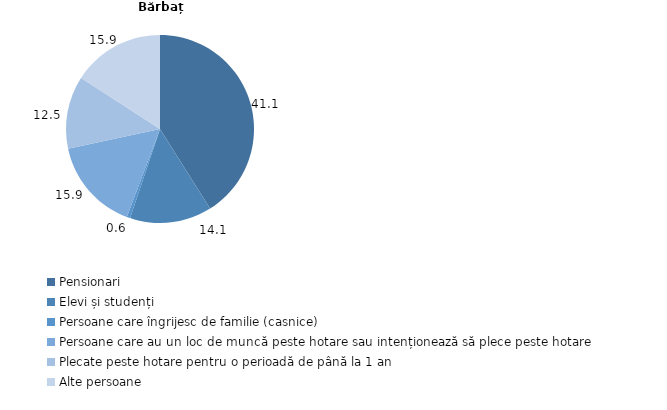
| Category | Bărbați |
|---|---|
| Pensionari | 41.054 |
| Elevi și studenți | 14.104 |
| Persoane care îngrijesc de familie (casnice) | 0.59 |
| Persoane care au un loc de muncă peste hotare sau intenționează să plece peste hotare | 15.881 |
| Plecate peste hotare pentru o perioadă de până la 1 an | 12.509 |
| Alte persoane | 15.861 |